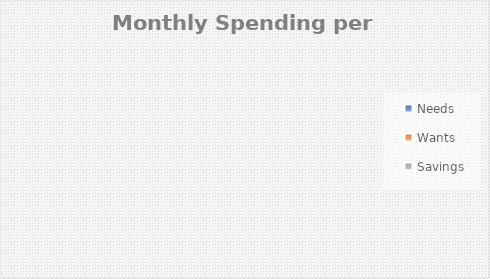
| Category | Series 0 |
|---|---|
| Needs | 0 |
| Wants | 0 |
| Savings | 0 |